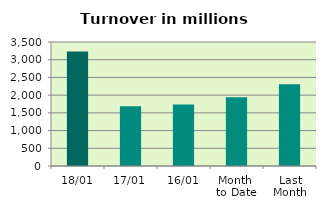
| Category | Series 0 |
|---|---|
| 18/01 | 3232.266 |
| 17/01 | 1683.583 |
| 16/01 | 1736.49 |
| Month 
to Date | 1941.595 |
| Last
Month | 2307.928 |